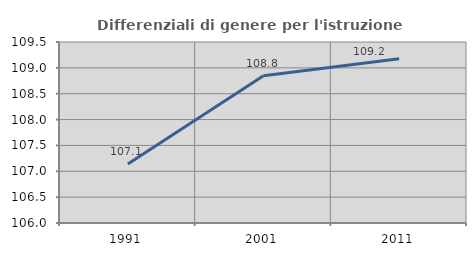
| Category | Differenziali di genere per l'istruzione superiore |
|---|---|
| 1991.0 | 107.142 |
| 2001.0 | 108.849 |
| 2011.0 | 109.178 |